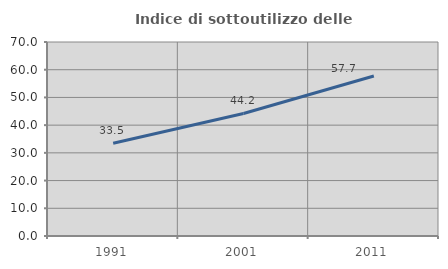
| Category | Indice di sottoutilizzo delle abitazioni  |
|---|---|
| 1991.0 | 33.456 |
| 2001.0 | 44.224 |
| 2011.0 | 57.746 |